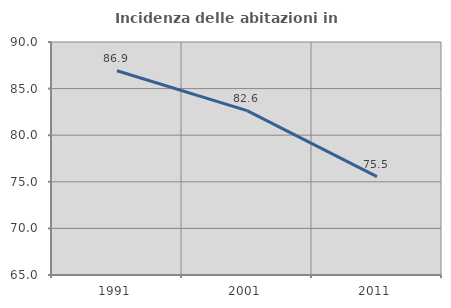
| Category | Incidenza delle abitazioni in proprietà  |
|---|---|
| 1991.0 | 86.916 |
| 2001.0 | 82.639 |
| 2011.0 | 75.547 |